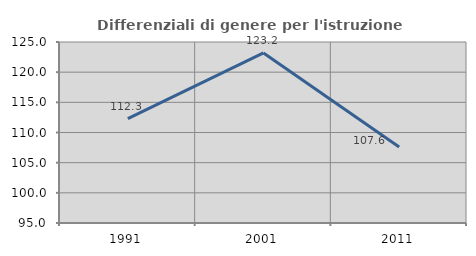
| Category | Differenziali di genere per l'istruzione superiore |
|---|---|
| 1991.0 | 112.292 |
| 2001.0 | 123.183 |
| 2011.0 | 107.581 |